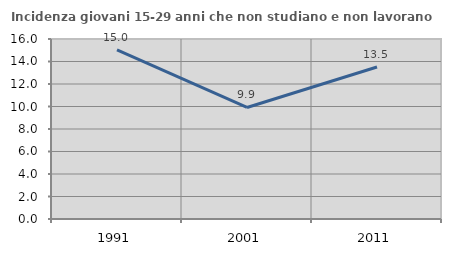
| Category | Incidenza giovani 15-29 anni che non studiano e non lavorano  |
|---|---|
| 1991.0 | 15.029 |
| 2001.0 | 9.913 |
| 2011.0 | 13.509 |